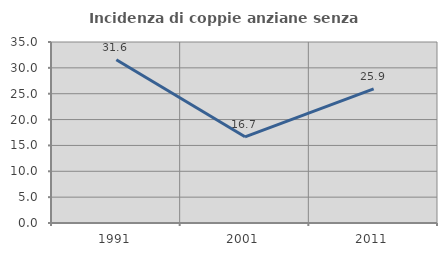
| Category | Incidenza di coppie anziane senza figli  |
|---|---|
| 1991.0 | 31.579 |
| 2001.0 | 16.667 |
| 2011.0 | 25.926 |